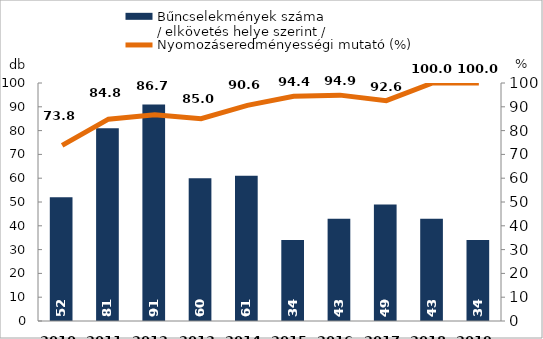
| Category | Bűncselekmények száma
/ elkövetés helye szerint / |
|---|---|
| 2010. év | 52 |
| 2011. év | 81 |
| 2012. év | 91 |
| 2013. év | 60 |
| 2014. év | 61 |
| 2015. év | 34 |
| 2016. év | 43 |
| 2017. év | 49 |
| 2018. év | 43 |
| 2019. év | 34 |